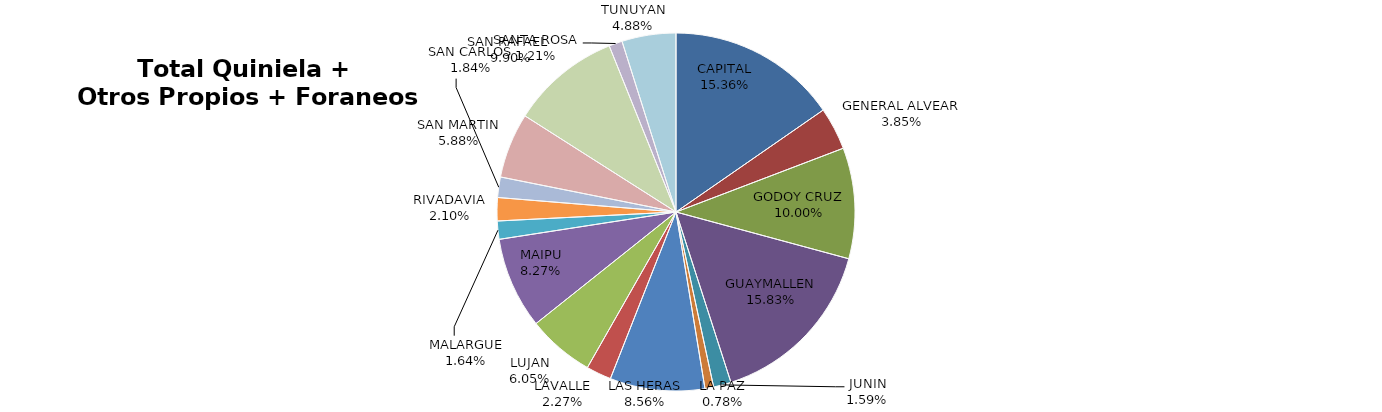
| Category | Total Quiniela + Otros Propios + Foraneos (Beneficio) |
|---|---|
| CAPITAL | 4970195.97 |
| GENERAL ALVEAR | 1244036.86 |
| GODOY CRUZ | 3237178.13 |
| GUAYMALLEN | 5121329.44 |
| JUNIN | 515780.25 |
| LA PAZ | 252463.31 |
| LAS HERAS | 2769811.44 |
| LAVALLE | 734720.79 |
| LUJAN | 1957962.29 |
| MAIPU | 2674453.9 |
| MALARGUE | 531627.17 |
| RIVADAVIA | 677890.98 |
| SAN CARLOS | 596507.94 |
| SAN MARTIN | 1904062.25 |
| SAN RAFAEL  | 3202099.97 |
| SANTA ROSA | 390995.53 |
| TUNUYAN | 1577638.74 |